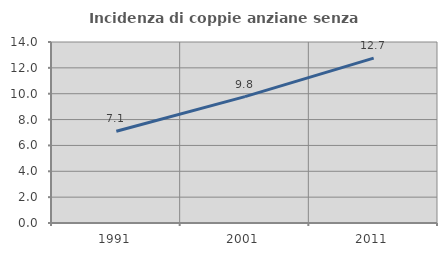
| Category | Incidenza di coppie anziane senza figli  |
|---|---|
| 1991.0 | 7.101 |
| 2001.0 | 9.779 |
| 2011.0 | 12.748 |